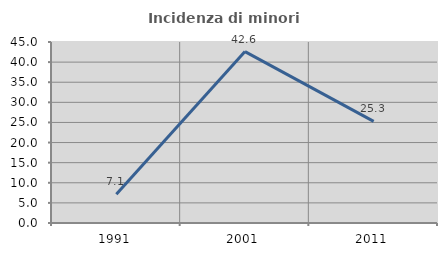
| Category | Incidenza di minori stranieri |
|---|---|
| 1991.0 | 7.143 |
| 2001.0 | 42.623 |
| 2011.0 | 25.258 |